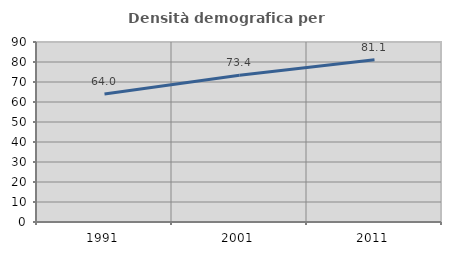
| Category | Densità demografica |
|---|---|
| 1991.0 | 64.029 |
| 2001.0 | 73.372 |
| 2011.0 | 81.096 |